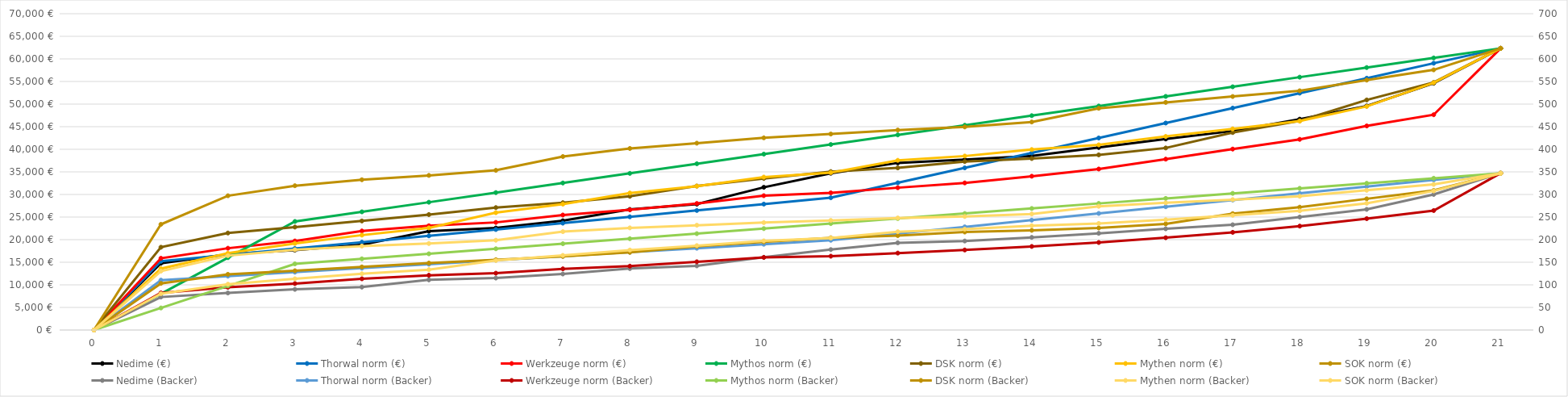
| Category | Nedime (€) | Thorwal norm (€) | Werkzeuge norm (€) | Mythos norm (€) | DSK norm (€) | Mythen norm (€) | SOK norm (€) |
|---|---|---|---|---|---|---|---|
| 0.0 | 0 | 0 | 0 | 0 | 0 | 0 | 0 |
| 1.0 | 14771 | 15220.89 | 15879.347 | 8008.081 | 18321.784 | 13585.517 | 23389.671 |
| 2.0 | 16764 | 16625.895 | 18103.852 | 16016.162 | 21471.045 | 16993.673 | 29715.191 |
| 3.0 | 17674 | 18030.901 | 19704.692 | 24024.243 | 22786.718 | 19168.104 | 31934.909 |
| 4.0 | 18881 | 19435.906 | 21920.789 | 26153.174 | 24137.624 | 21005.875 | 33260.328 |
| 5.0 | 21886 | 20840.911 | 23073.071 | 28282.105 | 25549.934 | 22597.041 | 34216.924 |
| 6.0 | 22571 | 22245.916 | 23816.279 | 30411.036 | 27093.107 | 25963.633 | 35342.683 |
| 7.0 | 24180 | 23650.922 | 25452.213 | 32539.967 | 28176.248 | 27863.056 | 38393.362 |
| 8.0 | 26679 | 25055.927 | 26607.421 | 34668.898 | 29592.585 | 30317.344 | 40180.658 |
| 9.0 | 27868 | 26460.932 | 28001.712 | 36797.829 | 31860.032 | 31844.779 | 41350.467 |
| 10.0 | 31587 | 27865.937 | 29730.867 | 38926.76 | 33546.148 | 33841.183 | 42536.958 |
| 11.0 | 34703 | 29270.942 | 30365.134 | 41055.691 | 35065.162 | 34832.457 | 43373.914 |
| 12.0 | 36986 | 32578.348 | 31495.483 | 43184.622 | 35879.53 | 37557.596 | 44253.617 |
| 13.0 | 37704 | 35885.754 | 32558.566 | 45313.553 | 37285.298 | 38504.537 | 44945.91 |
| 14.0 | 38541 | 39193.16 | 34038.035 | 47442.483 | 37955.717 | 39940.534 | 46038.827 |
| 15.0 | 40401 | 42500.565 | 35630.832 | 49571.414 | 38763.543 | 40976.835 | 49073.867 |
| 16.0 | 42277 | 45807.971 | 37819.146 | 51700.345 | 40290.106 | 42838.852 | 50374.785 |
| 17.0 | 44039 | 49115.377 | 40047.307 | 53829.276 | 43704.616 | 44512.45 | 51677.267 |
| 18.0 | 46661 | 52422.783 | 42194.31 | 55958.207 | 46292.174 | 46238.002 | 52943.517 |
| 19.0 | 49576 | 55730.188 | 45163.486 | 58087.138 | 50920.687 | 49482.677 | 55306.856 |
| 20.0 | 54612 | 59037.594 | 47642.794 | 60216.069 | 54792.209 | 54719.599 | 57577.401 |
| 21.0 | 62345 | 62345 | 62345 | 62345 | 62345 | 62345 | 62345 |